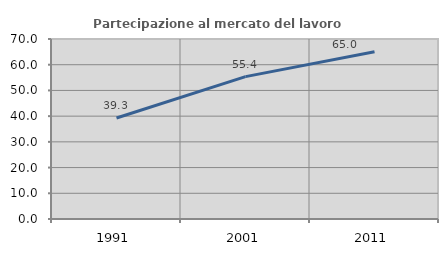
| Category | Partecipazione al mercato del lavoro  femminile |
|---|---|
| 1991.0 | 39.259 |
| 2001.0 | 55.372 |
| 2011.0 | 65.031 |